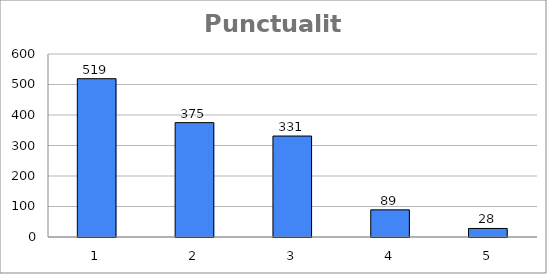
| Category | Series 0 |
|---|---|
| 0 | 519 |
| 1 | 375 |
| 2 | 331 |
| 3 | 89 |
| 4 | 28 |